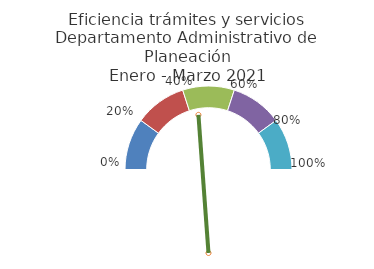
| Category | 1.44996584 |
|---|---|
| 0.0 | 0.2 |
| 0.2 | 0.2 |
| 0.4 | 0.2 |
| 0.6 | 0.2 |
| 0.8 | 0.2 |
| 1.0 | 1 |